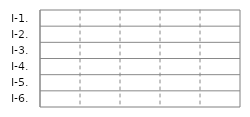
| Category | IN | OUT |
|---|---|---|
| I-1. | 0 | 0 |
| I-2. | 0 | 0 |
| I-3. | 0 | 0 |
| I-4. | 0 | 0 |
| I-5. | 0 | 0 |
| I-6. | 0 | 0 |